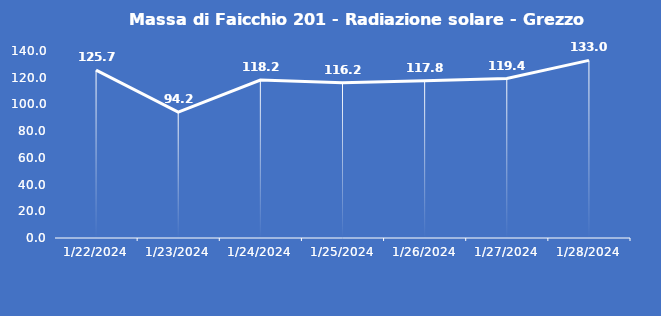
| Category | Massa di Faicchio 201 - Radiazione solare - Grezzo (W/m2) |
|---|---|
| 1/22/24 | 125.7 |
| 1/23/24 | 94.2 |
| 1/24/24 | 118.2 |
| 1/25/24 | 116.2 |
| 1/26/24 | 117.8 |
| 1/27/24 | 119.4 |
| 1/28/24 | 133 |